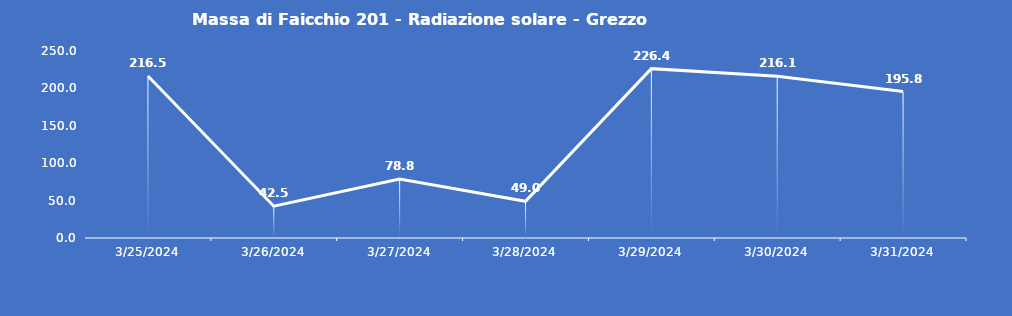
| Category | Massa di Faicchio 201 - Radiazione solare - Grezzo (W/m2) |
|---|---|
| 3/25/24 | 216.5 |
| 3/26/24 | 42.5 |
| 3/27/24 | 78.8 |
| 3/28/24 | 49 |
| 3/29/24 | 226.4 |
| 3/30/24 | 216.1 |
| 3/31/24 | 195.8 |